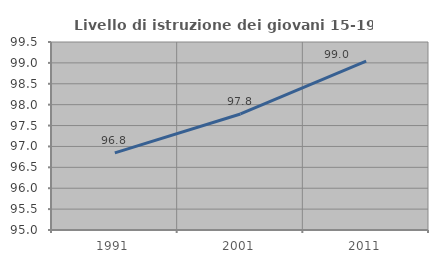
| Category | Livello di istruzione dei giovani 15-19 anni |
|---|---|
| 1991.0 | 96.845 |
| 2001.0 | 97.778 |
| 2011.0 | 99.045 |